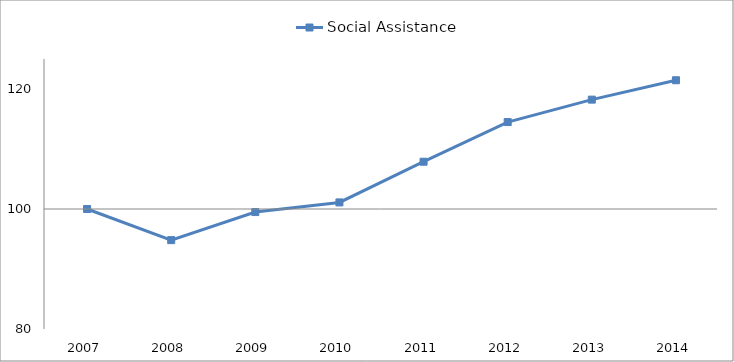
| Category | Social Assistance |
|---|---|
| 2007.0 | 100 |
| 2008.0 | 94.813 |
| 2009.0 | 99.49 |
| 2010.0 | 101.097 |
| 2011.0 | 107.88 |
| 2012.0 | 114.491 |
| 2013.0 | 118.229 |
| 2014.0 | 121.46 |